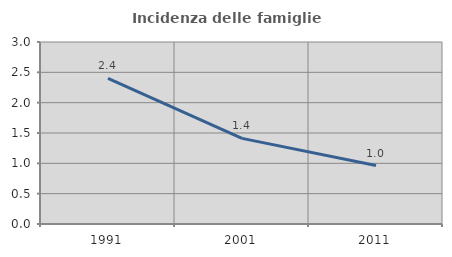
| Category | Incidenza delle famiglie numerose |
|---|---|
| 1991.0 | 2.399 |
| 2001.0 | 1.411 |
| 2011.0 | 0.963 |